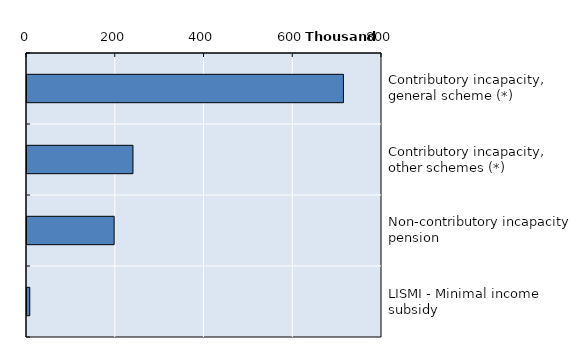
| Category | Series 0 |
|---|---|
| Contributory incapacity, general scheme (*) | 713064.917 |
| Contributory incapacity, other schemes (*) | 238773 |
| Non-contributory incapacity pension | 196374.748 |
| LISMI - Minimal income subsidy | 6201.167 |